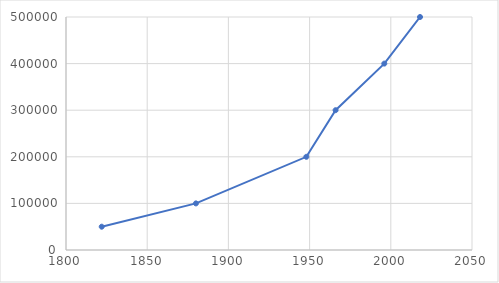
| Category | Population |
|---|---|
| 1822.0 | 50000 |
| 1880.0 | 100000 |
| 1948.0 | 200000 |
| 1966.0 | 300000 |
| 1996.0 | 400000 |
| 2018.0 | 500000 |